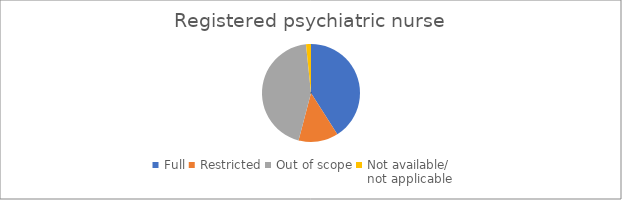
| Category | Registered psychiatric nurse | Nurse practitioner | Registered nurse |
|---|---|---|---|
| Full | 25 | 0 | 24 |
| Restricted | 8 | 0 | 18 |
| Out of scope | 27 | 0 | 19 |
| Not available/
not applicable | 1 | 0 | 0 |